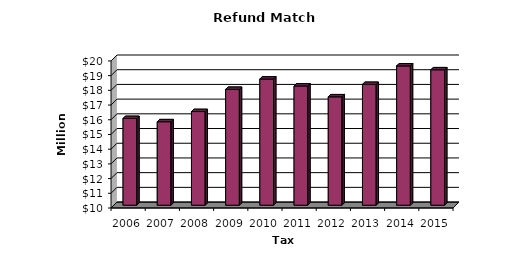
| Category | Total |
|---|---|
| 2006.0 | 15.896 |
| 2007.0 | 15.673 |
| 2008.0 | 16.367 |
| 2009.0 | 17.876 |
| 2010.0 | 18.578 |
| 2011.0 | 18.105 |
| 2012.0 | 17.369 |
| 2013.0 | 18.212 |
| 2014.0 | 19.469 |
| 2015.0 | 19.206 |